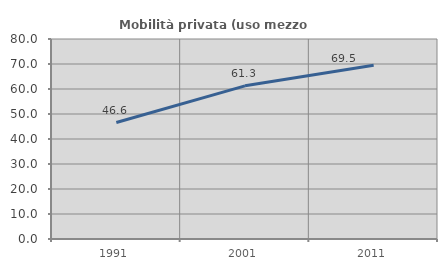
| Category | Mobilità privata (uso mezzo privato) |
|---|---|
| 1991.0 | 46.578 |
| 2001.0 | 61.272 |
| 2011.0 | 69.51 |